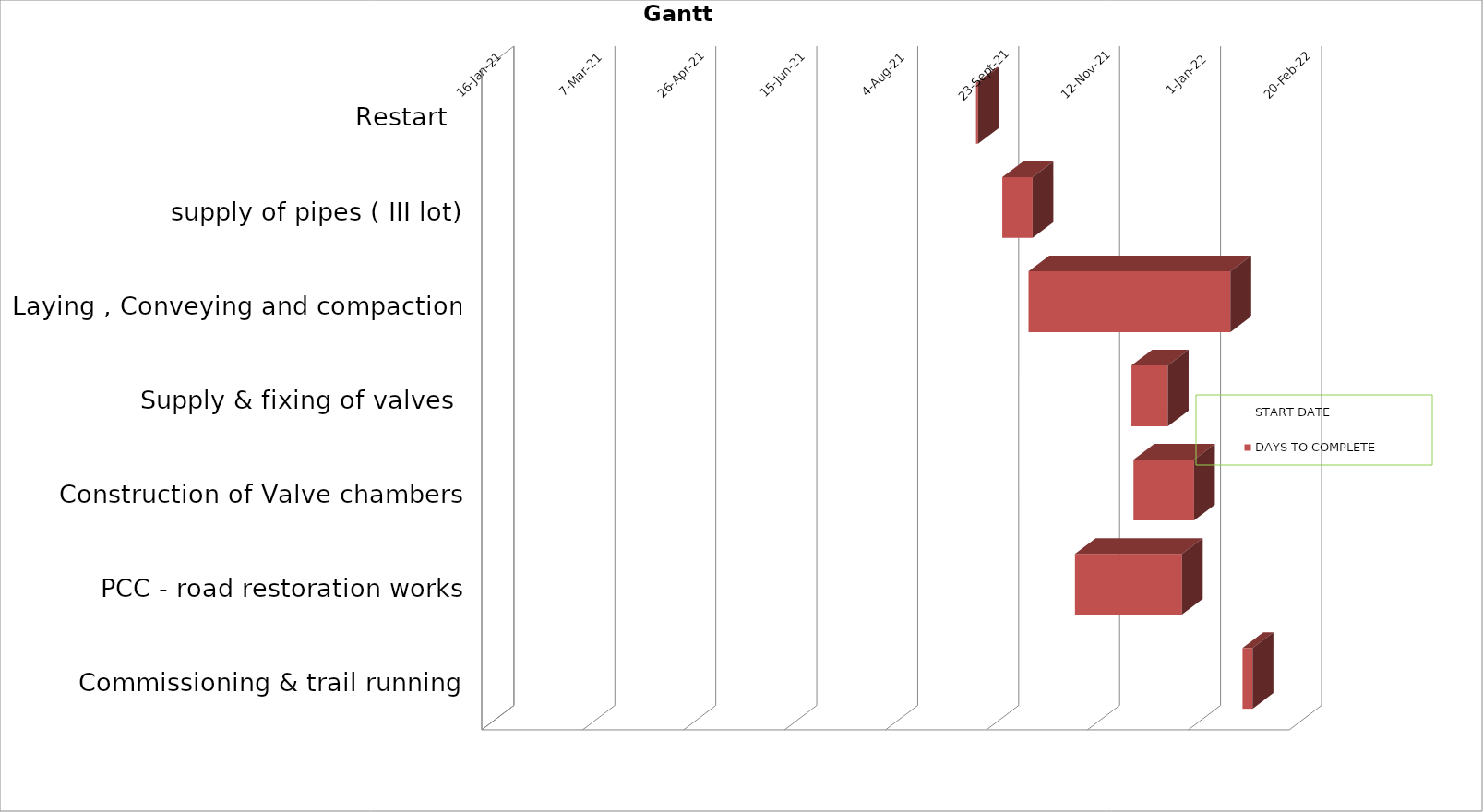
| Category | START DATE | DAYS TO COMPLETE |
|---|---|---|
| Restart  | 2021-09-15 | 1 |
| supply of pipes ( III lot) | 2021-09-28 | 15 |
| Laying , Conveying and compaction | 2021-10-11 | 100 |
| Supply & fixing of valves  | 2021-12-01 | 18 |
| Construction of Valve chambers | 2021-12-02 | 30 |
| PCC - road restoration works | 2021-11-03 | 53 |
| Commissioning & trail running | 2022-01-25 | 5 |